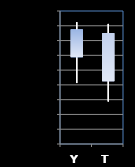
| Category | Series 0 | Series 1 | Series 2 | Series 3 |
|---|---|---|---|---|
| Y | 696.75 | 701.5 | 693.25 | 700.5 |
| T | 700 | 701.25 | 690.75 | 693.5 |